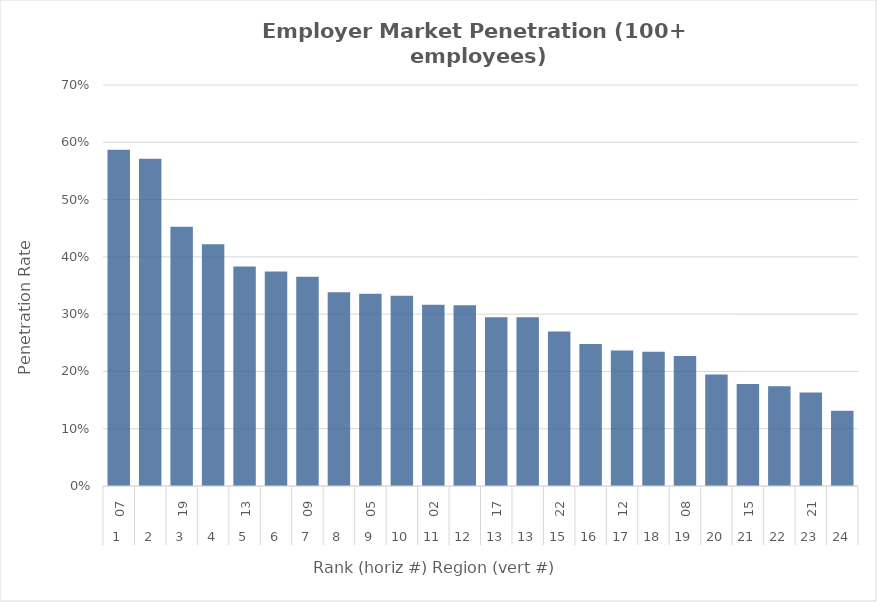
| Category | Rate |
|---|---|
| 0 | 0.587 |
| 1 | 0.571 |
| 2 | 0.452 |
| 3 | 0.422 |
| 4 | 0.383 |
| 5 | 0.374 |
| 6 | 0.365 |
| 7 | 0.338 |
| 8 | 0.336 |
| 9 | 0.332 |
| 10 | 0.316 |
| 11 | 0.315 |
| 12 | 0.295 |
| 13 | 0.295 |
| 14 | 0.27 |
| 15 | 0.248 |
| 16 | 0.236 |
| 17 | 0.234 |
| 18 | 0.227 |
| 19 | 0.194 |
| 20 | 0.178 |
| 21 | 0.174 |
| 22 | 0.163 |
| 23 | 0.131 |